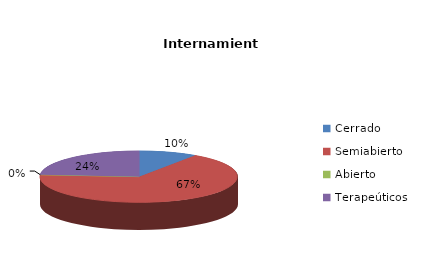
| Category | Series 0 |
|---|---|
| Cerrado | 2 |
| Semiabierto | 14 |
| Abierto | 0 |
| Terapeúticos | 5 |